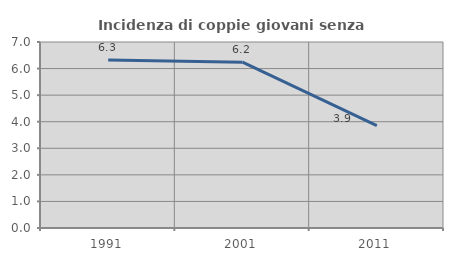
| Category | Incidenza di coppie giovani senza figli |
|---|---|
| 1991.0 | 6.324 |
| 2001.0 | 6.239 |
| 2011.0 | 3.852 |